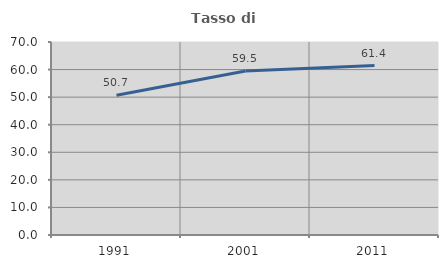
| Category | Tasso di occupazione   |
|---|---|
| 1991.0 | 50.676 |
| 2001.0 | 59.453 |
| 2011.0 | 61.442 |